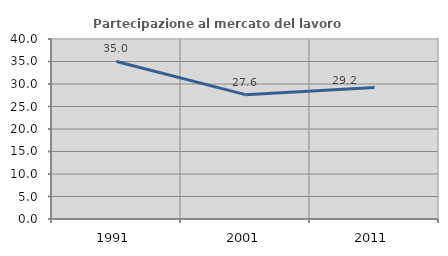
| Category | Partecipazione al mercato del lavoro  femminile |
|---|---|
| 1991.0 | 35.015 |
| 2001.0 | 27.636 |
| 2011.0 | 29.24 |